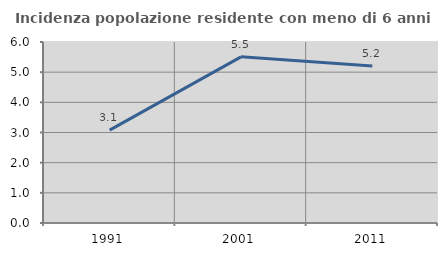
| Category | Incidenza popolazione residente con meno di 6 anni |
|---|---|
| 1991.0 | 3.079 |
| 2001.0 | 5.508 |
| 2011.0 | 5.206 |